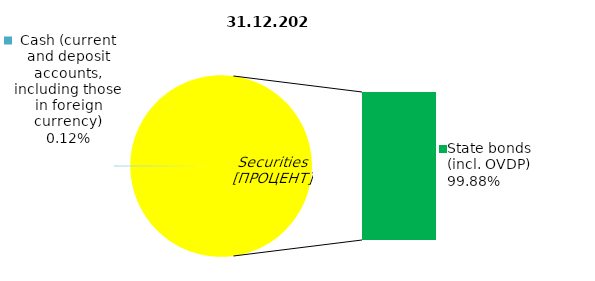
| Category | Series 0 |
|---|---|
| Cash (current and deposit accounts, including those in foreign currency) | 0.208 |
| Bank metals | 0 |
| Real estate | 0 |
| Other assets | 0 |
| Equities | 0 |
| Corporate bonds | 0 |
| Municipal bonds | 0 |
| State bonds (incl. OVDP) | 170.477 |
| Mortgage Certificates | 0 |